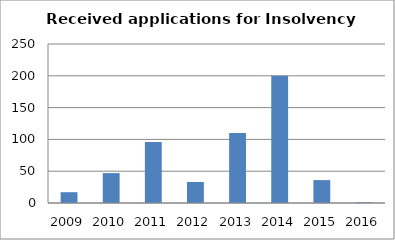
| Category | Series 0 |
|---|---|
| 2009.0 | 17 |
| 2010.0 | 47 |
| 2011.0 | 96 |
| 2012.0 | 33 |
| 2013.0 | 110 |
| 2014.0 | 200 |
| 2015.0 | 36 |
| 2016.0 | 1 |